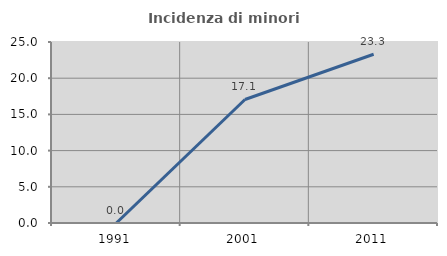
| Category | Incidenza di minori stranieri |
|---|---|
| 1991.0 | 0 |
| 2001.0 | 17.059 |
| 2011.0 | 23.313 |